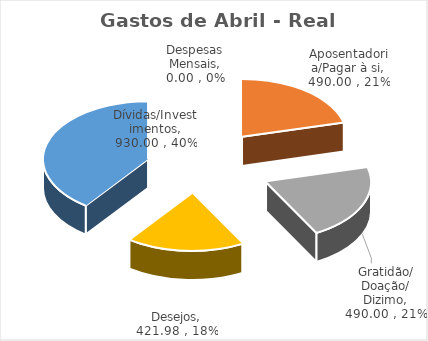
| Category | Gastos de Abril - Real Acumulado |
|---|---|
| Despesas Mensais | 0 |
| Aposentadoria/Pagar à si | 490 |
| Gratidão/ Doação/ Dizimo | 490 |
| Desejos | 421.98 |
| Dívidas/Investimentos | 930 |